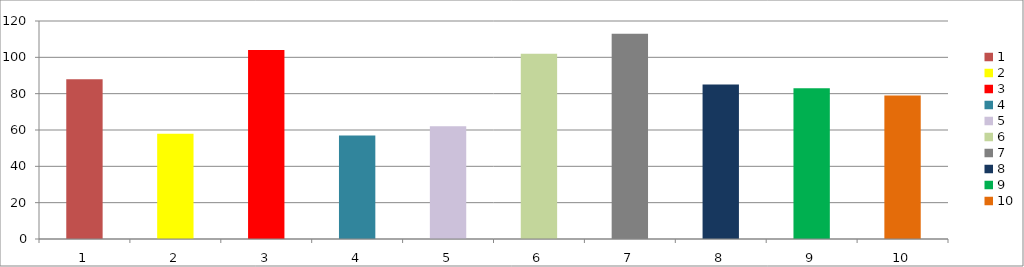
| Category | Series 0 |
|---|---|
| 0 | 88 |
| 1 | 58 |
| 2 | 104 |
| 3 | 57 |
| 4 | 62 |
| 5 | 102 |
| 6 | 113 |
| 7 | 85 |
| 8 | 83 |
| 9 | 79 |